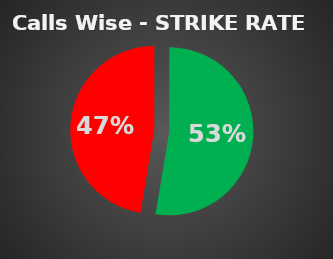
| Category | Series 0 |
|---|---|
| 0 | 0.526 |
| 1 | 0.474 |